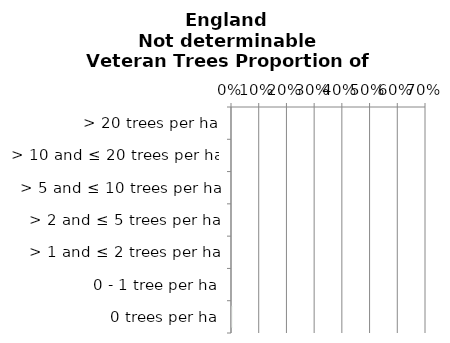
| Category | Not determinable |
|---|---|
| 0 trees per ha | 0.001 |
| 0 - 1 tree per ha | 0 |
| > 1 and ≤ 2 trees per ha | 0 |
| > 2 and ≤ 5 trees per ha | 0 |
| > 5 and ≤ 10 trees per ha | 0 |
| > 10 and ≤ 20 trees per ha | 0 |
| > 20 trees per ha | 0 |